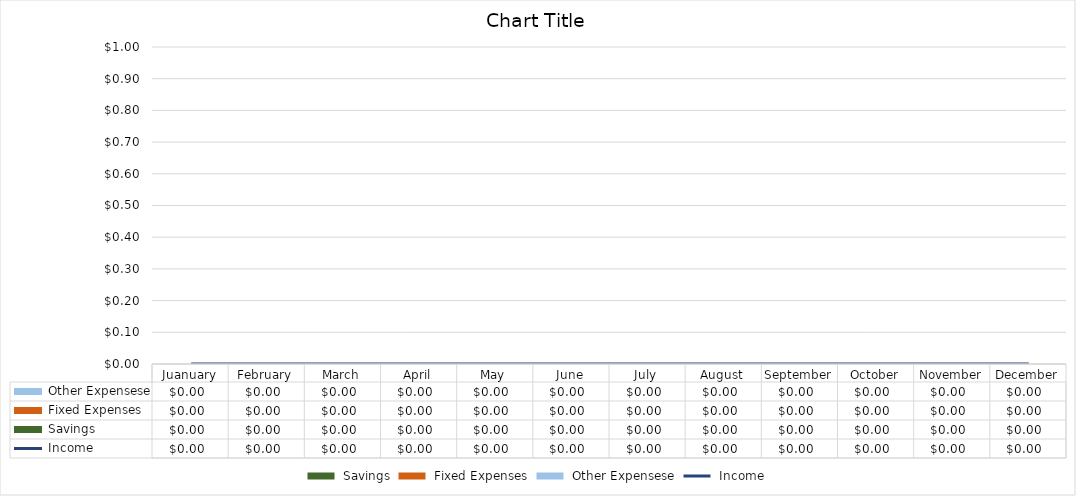
| Category | Savings | Fixed Expenses | Other Expenses |
|---|---|---|---|
| Juanuary | 0 | 0 | 0 |
| February | 0 | 0 | 0 |
| March | 0 | 0 | 0 |
| April | 0 | 0 | 0 |
| May | 0 | 0 | 0 |
| June | 0 | 0 | 0 |
| July | 0 | 0 | 0 |
| August | 0 | 0 | 0 |
| September | 0 | 0 | 0 |
| October | 0 | 0 | 0 |
| November | 0 | 0 | 0 |
| December | 0 | 0 | 0 |